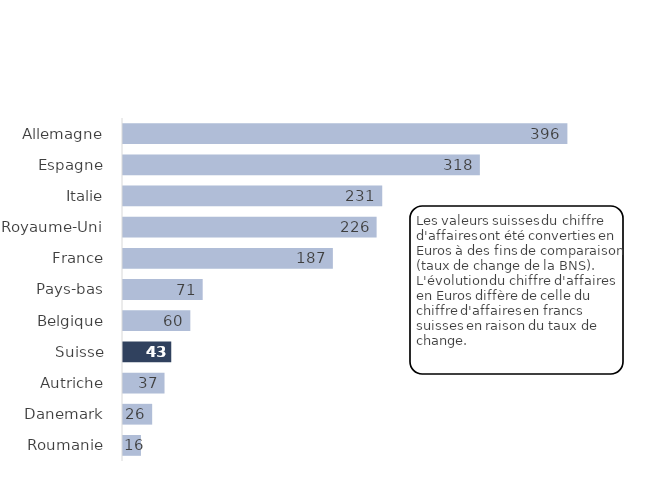
| Category | 2020 |
|---|---|
| Roumanie | 16 |
| Danemark | 26 |
| Autriche | 37 |
| Suisse | 43 |
| Belgique | 60 |
| Pays-bas | 71 |
| France | 187 |
| Royaume-Uni | 226 |
| Italie | 231 |
| Espagne | 318 |
| Allemagne | 396 |